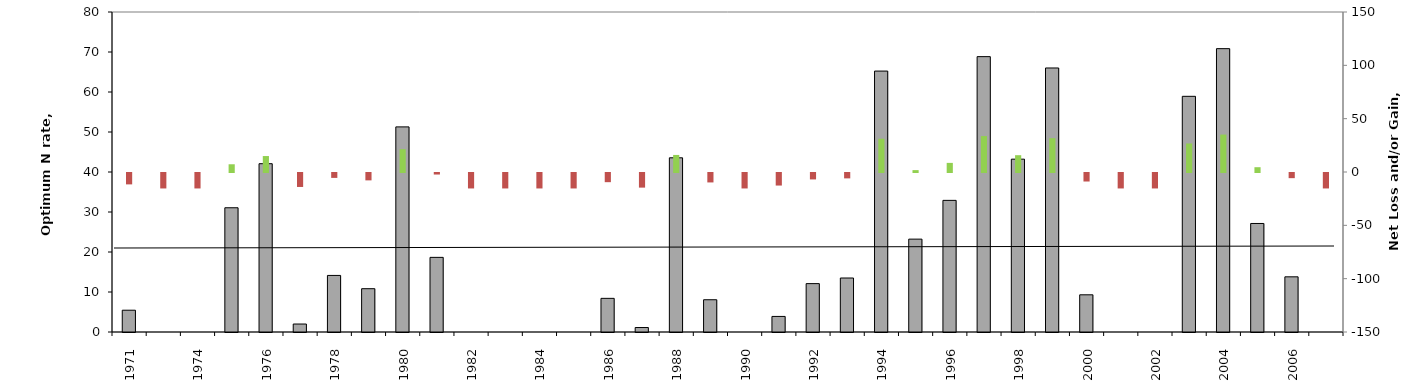
| Category | N Requirement |
|---|---|
| 1971.0 | 5.449 |
| 1972.0 | 0 |
| 1974.0 | 0 |
| 1975.0 | 31.059 |
| 1976.0 | 42.077 |
| 1977.0 | 1.995 |
| 1978.0 | 14.141 |
| 1979.0 | 10.827 |
| 1980.0 | 51.28 |
| 1981.0 | 18.656 |
| 1982.0 | 0 |
| 1983.0 | 0 |
| 1984.0 | 0 |
| 1985.0 | 0 |
| 1986.0 | 8.41 |
| 1987.0 | 1.119 |
| 1988.0 | 43.551 |
| 1989.0 | 8.066 |
| 1990.0 | 0 |
| 1991.0 | 3.893 |
| 1992.0 | 12.094 |
| 1993.0 | 13.499 |
| 1994.0 | 65.233 |
| 1995.0 | 23.218 |
| 1996.0 | 32.907 |
| 1997.0 | 68.84 |
| 1998.0 | 43.21 |
| 1999.0 | 66.008 |
| 2000.0 | 9.299 |
| 2001.0 | 0 |
| 2002.0 | 0 |
| 2003.0 | 58.918 |
| 2004.0 | 70.84 |
| 2005.0 | 27.131 |
| 2006.0 | 13.795 |
| 2007.0 | 0 |